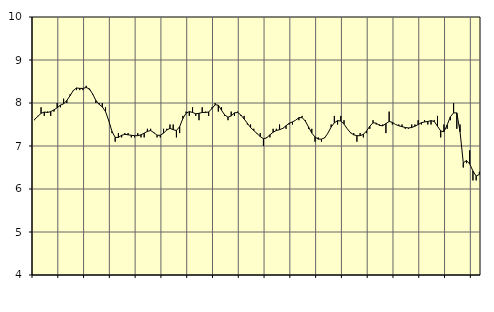
| Category | Piggar | Transport, SNI 49-531 |
|---|---|---|
| nan | 7.6 | 7.62 |
| 87.0 | 7.7 | 7.69 |
| 87.0 | 7.9 | 7.76 |
| 87.0 | 7.7 | 7.79 |
| nan | 7.8 | 7.78 |
| 88.0 | 7.7 | 7.8 |
| 88.0 | 7.8 | 7.84 |
| 88.0 | 8 | 7.89 |
| nan | 7.9 | 7.95 |
| 89.0 | 8.1 | 7.98 |
| 89.0 | 8 | 8.06 |
| 89.0 | 8.2 | 8.17 |
| nan | 8.3 | 8.29 |
| 90.0 | 8.3 | 8.35 |
| 90.0 | 8.3 | 8.34 |
| 90.0 | 8.3 | 8.34 |
| nan | 8.4 | 8.36 |
| 91.0 | 8.3 | 8.33 |
| 91.0 | 8.2 | 8.21 |
| 91.0 | 8 | 8.06 |
| nan | 8 | 7.97 |
| 92.0 | 8 | 7.91 |
| 92.0 | 7.9 | 7.8 |
| 92.0 | 7.6 | 7.59 |
| nan | 7.3 | 7.34 |
| 93.0 | 7.1 | 7.2 |
| 93.0 | 7.3 | 7.2 |
| 93.0 | 7.2 | 7.25 |
| nan | 7.3 | 7.27 |
| 94.0 | 7.3 | 7.26 |
| 94.0 | 7.2 | 7.25 |
| 94.0 | 7.2 | 7.24 |
| nan | 7.3 | 7.24 |
| 95.0 | 7.2 | 7.26 |
| 95.0 | 7.2 | 7.3 |
| 95.0 | 7.4 | 7.34 |
| nan | 7.4 | 7.36 |
| 96.0 | 7.3 | 7.31 |
| 96.0 | 7.2 | 7.25 |
| 96.0 | 7.2 | 7.25 |
| nan | 7.4 | 7.3 |
| 97.0 | 7.4 | 7.37 |
| 97.0 | 7.5 | 7.41 |
| 97.0 | 7.5 | 7.38 |
| nan | 7.2 | 7.36 |
| 98.0 | 7.3 | 7.45 |
| 98.0 | 7.7 | 7.64 |
| 98.0 | 7.8 | 7.76 |
| nan | 7.7 | 7.8 |
| 99.0 | 7.9 | 7.78 |
| 99.0 | 7.7 | 7.75 |
| 99.0 | 7.6 | 7.76 |
| nan | 7.9 | 7.78 |
| 0.0 | 7.8 | 7.78 |
| 0.0 | 7.7 | 7.79 |
| 0.0 | 7.9 | 7.87 |
| nan | 8 | 7.96 |
| 1.0 | 7.8 | 7.95 |
| 1.0 | 7.9 | 7.83 |
| 1.0 | 7.7 | 7.72 |
| nan | 7.6 | 7.67 |
| 2.0 | 7.8 | 7.7 |
| 2.0 | 7.7 | 7.77 |
| 2.0 | 7.8 | 7.78 |
| nan | 7.7 | 7.72 |
| 3.0 | 7.7 | 7.63 |
| 3.0 | 7.5 | 7.53 |
| 3.0 | 7.5 | 7.43 |
| nan | 7.4 | 7.36 |
| 4.0 | 7.3 | 7.29 |
| 4.0 | 7.3 | 7.22 |
| 4.0 | 7 | 7.17 |
| nan | 7.2 | 7.19 |
| 5.0 | 7.2 | 7.26 |
| 5.0 | 7.4 | 7.32 |
| 5.0 | 7.4 | 7.36 |
| nan | 7.5 | 7.38 |
| 6.0 | 7.4 | 7.41 |
| 6.0 | 7.4 | 7.47 |
| 6.0 | 7.5 | 7.53 |
| nan | 7.5 | 7.56 |
| 7.0 | 7.6 | 7.6 |
| 7.0 | 7.6 | 7.66 |
| 7.0 | 7.7 | 7.66 |
| nan | 7.6 | 7.58 |
| 8.0 | 7.4 | 7.44 |
| 8.0 | 7.4 | 7.3 |
| 8.0 | 7.1 | 7.21 |
| nan | 7.2 | 7.16 |
| 9.0 | 7.1 | 7.16 |
| 9.0 | 7.2 | 7.19 |
| 9.0 | 7.3 | 7.3 |
| nan | 7.5 | 7.44 |
| 10.0 | 7.7 | 7.54 |
| 10.0 | 7.5 | 7.59 |
| 10.0 | 7.7 | 7.58 |
| nan | 7.6 | 7.51 |
| 11.0 | 7.4 | 7.4 |
| 11.0 | 7.3 | 7.31 |
| 11.0 | 7.3 | 7.26 |
| nan | 7.1 | 7.24 |
| 12.0 | 7.3 | 7.24 |
| 12.0 | 7.2 | 7.27 |
| 12.0 | 7.3 | 7.35 |
| nan | 7.4 | 7.46 |
| 13.0 | 7.6 | 7.54 |
| 13.0 | 7.5 | 7.53 |
| 13.0 | 7.5 | 7.48 |
| nan | 7.5 | 7.47 |
| 14.0 | 7.3 | 7.52 |
| 14.0 | 7.8 | 7.57 |
| 14.0 | 7.5 | 7.55 |
| nan | 7.5 | 7.5 |
| 15.0 | 7.5 | 7.47 |
| 15.0 | 7.5 | 7.45 |
| 15.0 | 7.4 | 7.43 |
| nan | 7.4 | 7.42 |
| 16.0 | 7.5 | 7.43 |
| 16.0 | 7.5 | 7.46 |
| 16.0 | 7.6 | 7.5 |
| nan | 7.5 | 7.54 |
| 17.0 | 7.6 | 7.56 |
| 17.0 | 7.5 | 7.57 |
| 17.0 | 7.5 | 7.59 |
| nan | 7.6 | 7.57 |
| 18.0 | 7.7 | 7.46 |
| 18.0 | 7.2 | 7.35 |
| 18.0 | 7.5 | 7.33 |
| nan | 7.4 | 7.49 |
| 19.0 | 7.6 | 7.68 |
| 19.0 | 8 | 7.77 |
| 19.0 | 7.4 | 7.77 |
| nan | 7.5 | 7.33 |
| 20.0 | 6.5 | 6.61 |
| 20.0 | 6.6 | 6.66 |
| 20.0 | 6.9 | 6.58 |
| nan | 6.2 | 6.42 |
| 21.0 | 6.2 | 6.3 |
| 21.0 | 6.4 | 6.34 |